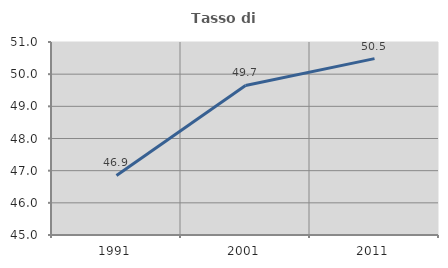
| Category | Tasso di occupazione   |
|---|---|
| 1991.0 | 46.85 |
| 2001.0 | 49.65 |
| 2011.0 | 50.483 |